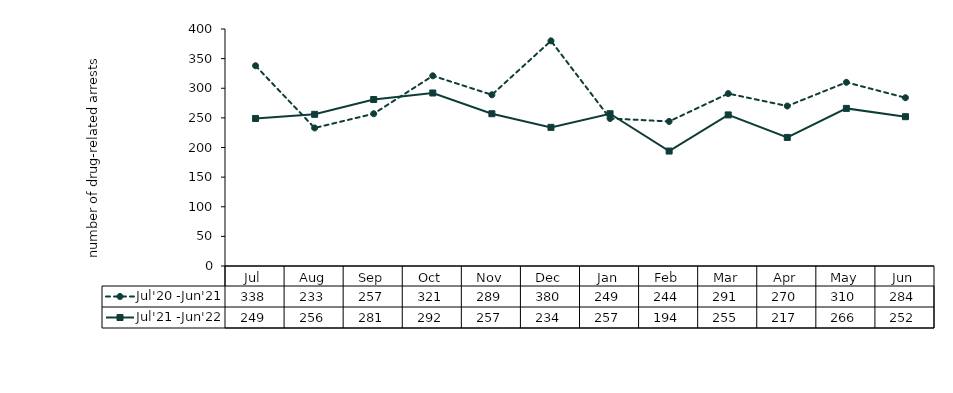
| Category | Jul'20 -Jun'21 | Jul'21 -Jun'22 |
|---|---|---|
| Jul | 338 | 249 |
| Aug | 233 | 256 |
| Sep | 257 | 281 |
| Oct | 321 | 292 |
| Nov | 289 | 257 |
| Dec | 380 | 234 |
| Jan | 249 | 257 |
| Feb | 244 | 194 |
| Mar | 291 | 255 |
| Apr | 270 | 217 |
| May | 310 | 266 |
| Jun | 284 | 252 |